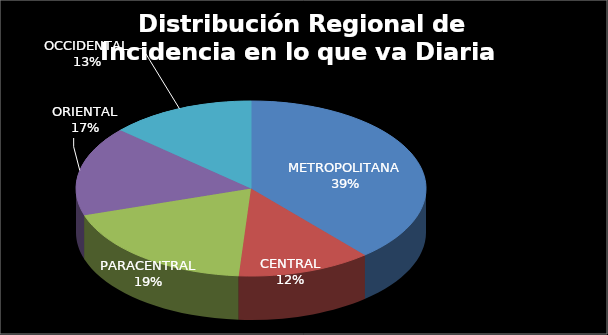
| Category | Series 0 |
|---|---|
| METROPOLITANA | 0.387 |
| CENTRAL | 0.124 |
| PARACENTRAL | 0.189 |
| ORIENTAL | 0.165 |
| OCCIDENTAL | 0.134 |